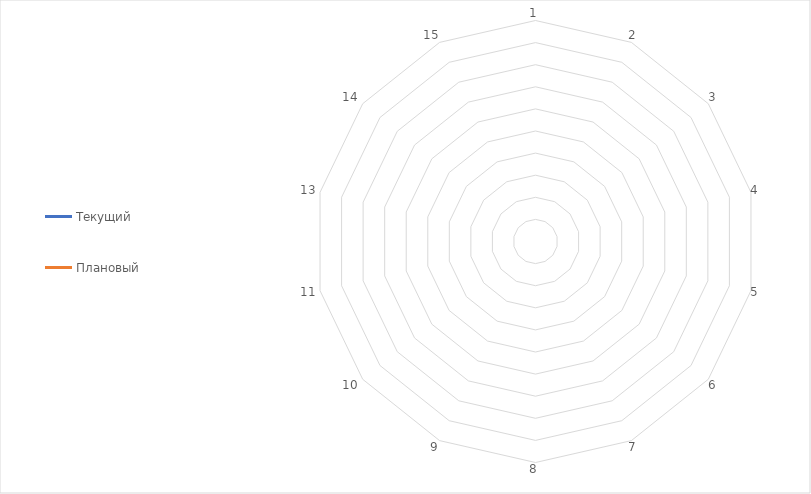
| Category | Текущий | Плановый |
|---|---|---|
| 1.0 | 0 | 0 |
| 2.0 | 0 | 0 |
| 3.0 | 0 | 0 |
| 4.0 | 0 | 0 |
| 5.0 | 0 | 0 |
| 6.0 | 0 | 0 |
| 7.0 | 0 | 0 |
| 8.0 | 0 | 0 |
| 9.0 | 0 | 0 |
| 10.0 | 0 | 0 |
| 11.0 | 0 | 0 |
| 13.0 | 0 | 0 |
| 14.0 | 0 | 0 |
| 15.0 | 0 | 0 |